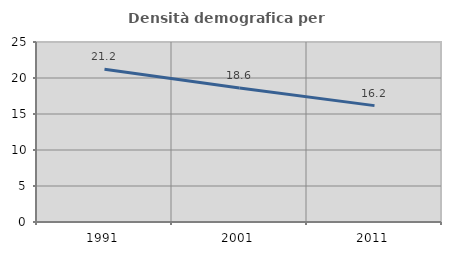
| Category | Densità demografica |
|---|---|
| 1991.0 | 21.206 |
| 2001.0 | 18.603 |
| 2011.0 | 16.164 |